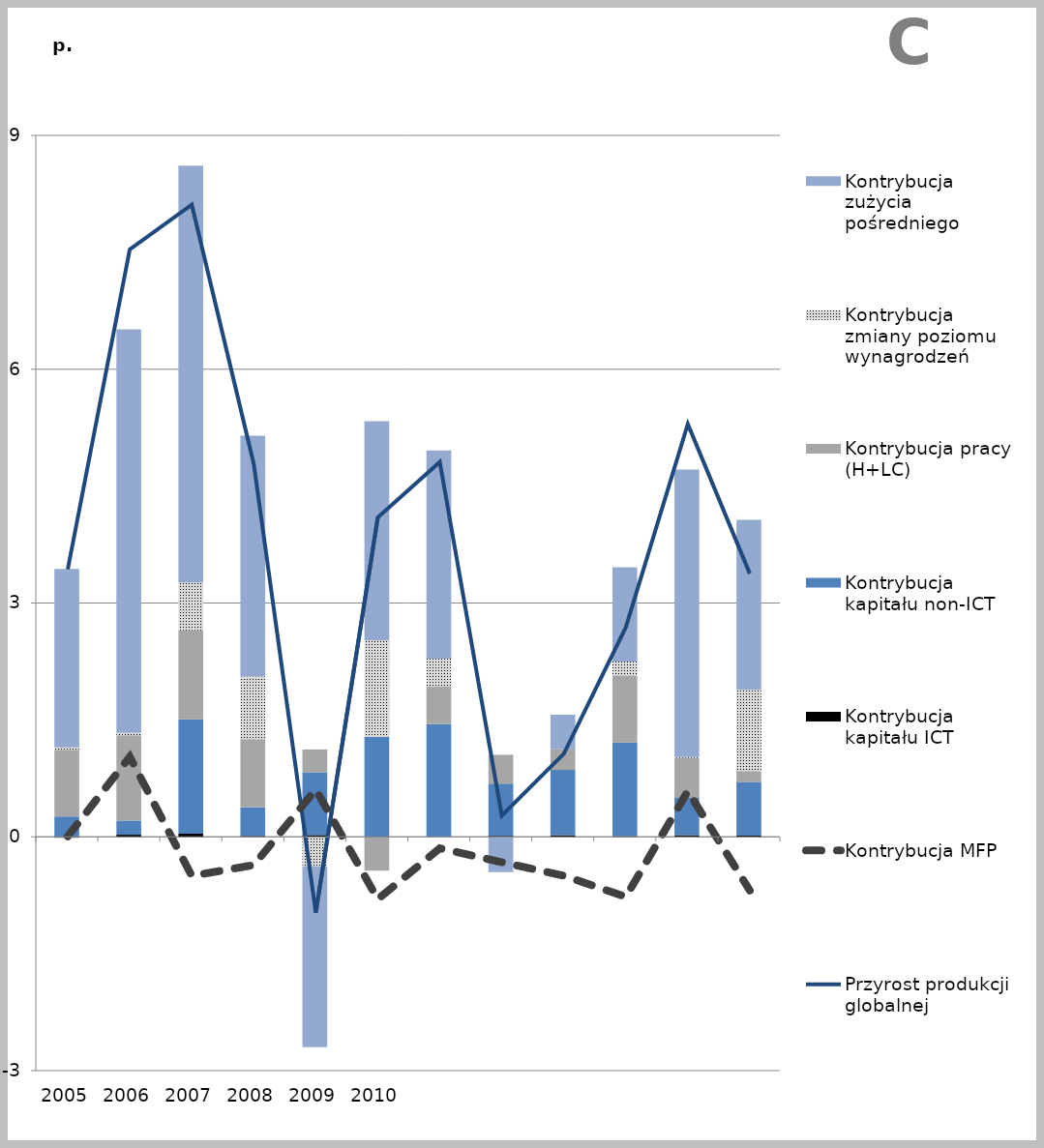
| Category | Kontrybucja kapitału ICT | Kontrybucja kapitału non-ICT | Kontrybucja pracy (H+LC) | Kontrybucja zmiany poziomu wynagrodzeń | Kontrybucja zużycia pośredniego |
|---|---|---|---|---|---|
| 2005.0 | -0.011 | 0.261 | 0.857 | 0.031 | 2.289 |
| 2006.0 | 0.027 | 0.181 | 1.095 | 0.03 | 5.178 |
| 2007.0 | 0.04 | 1.469 | 1.139 | 0.617 | 5.346 |
| 2008.0 | 0.011 | 0.366 | 0.877 | 0.803 | 3.089 |
| 2009.0 | 0.023 | 0.804 | 0.294 | -0.379 | -2.321 |
| 2010.0 | -0.004 | 1.282 | -0.43 | 1.239 | 2.811 |